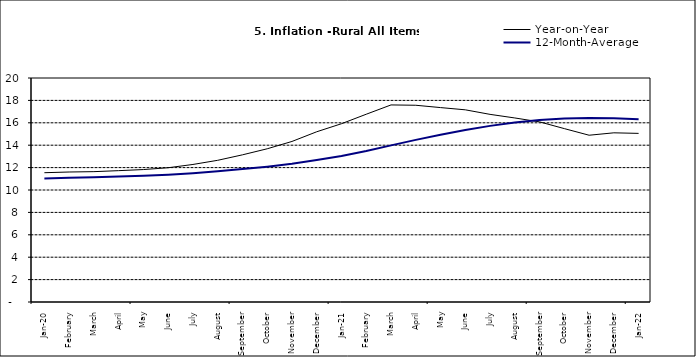
| Category | Year-on-Year | 12-Month-Average |
|---|---|---|
| Jan-20 | 11.543 | 11.037 |
| February | 11.606 | 11.086 |
| March | 11.639 | 11.141 |
| April | 11.728 | 11.197 |
| May | 11.826 | 11.261 |
| June | 11.988 | 11.355 |
| July | 12.28 | 11.493 |
| August | 12.651 | 11.664 |
| September | 13.14 | 11.864 |
| October | 13.68 | 12.086 |
| November | 14.335 | 12.346 |
| December | 15.2 | 12.67 |
| Jan-21 | 15.918 | 13.043 |
| February | 16.766 | 13.482 |
| March | 17.596 | 13.985 |
| April | 17.566 | 14.475 |
| May | 17.358 | 14.935 |
| June | 17.159 | 15.362 |
| July | 16.753 | 15.726 |
| August | 16.433 | 16.03 |
| September | 16.081 | 16.26 |
| October | 15.48 | 16.393 |
| November | 14.89 | 16.419 |
| December | 15.106 | 16.397 |
| Jan-22 | 15.055 | 16.313 |